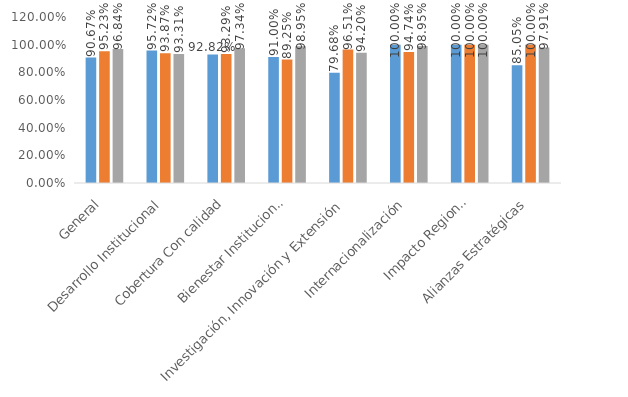
| Category | Objetivo | Componentes | Proyectos |
|---|---|---|---|
| General | 0.907 | 0.952 | 0.968 |
| Desarrollo Institucional | 0.957 | 0.939 | 0.933 |
| Cobertura Con calidad | 0.928 | 0.933 | 0.973 |
| Bienestar Institucional | 0.91 | 0.892 | 0.989 |
| Investigación, Innovación y Extensión | 0.797 | 0.965 | 0.942 |
| Internacionalización | 1 | 0.947 | 0.989 |
| Impacto Regional | 1 | 1 | 1 |
| Alianzas Estratégicas | 0.851 | 1 | 0.979 |